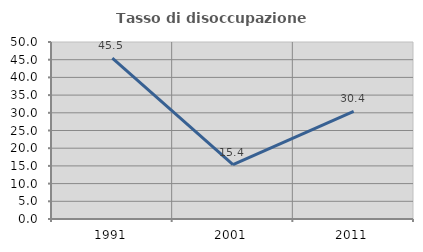
| Category | Tasso di disoccupazione giovanile  |
|---|---|
| 1991.0 | 45.455 |
| 2001.0 | 15.385 |
| 2011.0 | 30.435 |